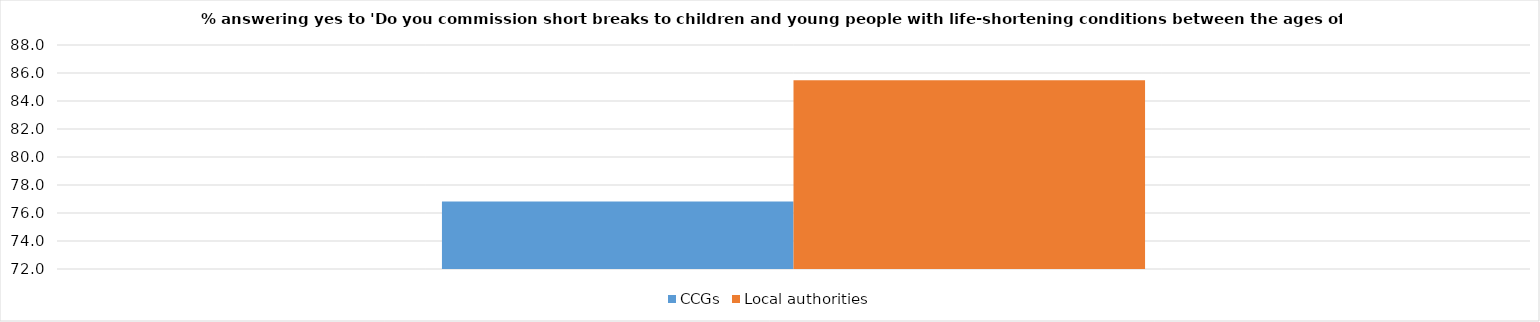
| Category | CCGs | Local authorities |
|---|---|---|
| 0 | 76.821 | 85.484 |